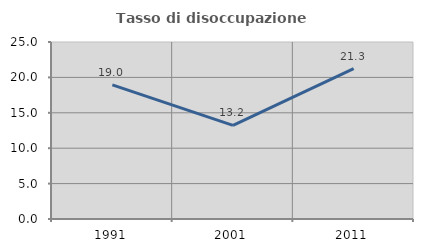
| Category | Tasso di disoccupazione giovanile  |
|---|---|
| 1991.0 | 18.954 |
| 2001.0 | 13.228 |
| 2011.0 | 21.25 |